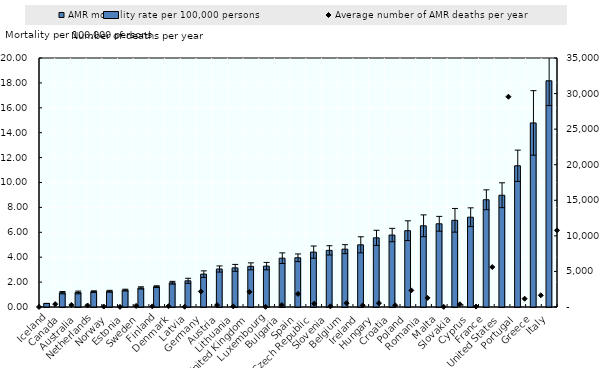
| Category | AMR mortality rate per 100,000 persons |
|---|---|
| Iceland | 0.283 |
| Canada | 1.151 |
| Australia | 1.166 |
| Netherlands | 1.235 |
| Norway | 1.261 |
| Estonia | 1.357 |
| Sweden | 1.531 |
| Finland | 1.633 |
| Denmark | 1.949 |
| Latvia | 2.103 |
| Germany | 2.641 |
| Austria | 3.052 |
| Lithuania | 3.143 |
| United Kingdom | 3.265 |
| Luxembourg | 3.284 |
| Bulgaria | 3.921 |
| Spain | 3.954 |
| Czech Republic | 4.409 |
| Slovenia | 4.549 |
| Belgium | 4.645 |
| Ireland | 4.995 |
| Hungary | 5.556 |
| Croatia | 5.779 |
| Poland | 6.128 |
| Romania | 6.523 |
| Malta | 6.683 |
| Slovakia | 6.963 |
| Cyprus | 7.212 |
| France | 8.615 |
| United States | 8.977 |
| Portugal | 11.344 |
| Greece | 14.786 |
| Italy | 18.169 |